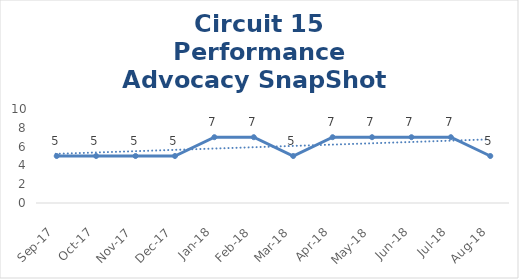
| Category | Circuit 15 |
|---|---|
| Sep-17 | 5 |
| Oct-17 | 5 |
| Nov-17 | 5 |
| Dec-17 | 5 |
| Jan-18 | 7 |
| Feb-18 | 7 |
| Mar-18 | 5 |
| Apr-18 | 7 |
| May-18 | 7 |
| Jun-18 | 7 |
| Jul-18 | 7 |
| Aug-18 | 5 |